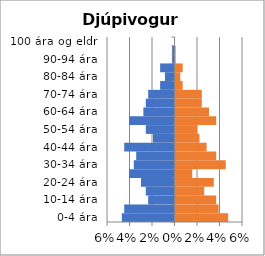
| Category | % karlar | %konur |
|---|---|---|
| 0-4 ára | -0.047 | 0.047 |
| 5-9 ára | -0.045 | 0.038 |
| 10-14 ára | -0.023 | 0.036 |
| 15-19 ára | -0.026 | 0.026 |
| 20-24 ára | -0.03 | 0.034 |
| 25-29 ára | -0.04 | 0.015 |
| 30-34 ára | -0.036 | 0.045 |
| 35-39 ára | -0.034 | 0.036 |
| 40-44 ára | -0.045 | 0.028 |
| 45-49 ára | -0.019 | 0.021 |
| 50-54 ára | -0.026 | 0.019 |
| 55-59 ára | -0.04 | 0.036 |
| 60-64 ára | -0.028 | 0.03 |
| 65-69 ára | -0.026 | 0.023 |
| 70-74 ára | -0.023 | 0.023 |
| 75-79 ára | -0.013 | 0.006 |
| 80-84 ára | -0.009 | 0.004 |
| 85-89 ára | -0.013 | 0.006 |
| 90-94 ára | -0.002 | 0 |
| 95-99 ára | -0.002 | 0 |
| 100 ára og eldri | 0 | 0 |